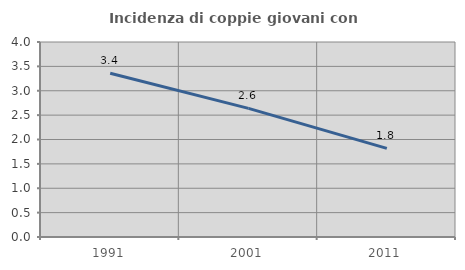
| Category | Incidenza di coppie giovani con figli |
|---|---|
| 1991.0 | 3.358 |
| 2001.0 | 2.639 |
| 2011.0 | 1.818 |